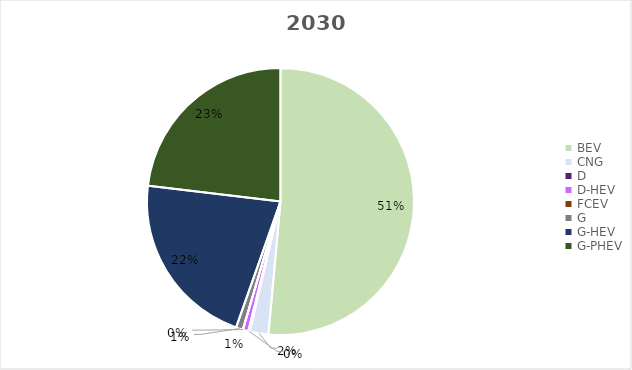
| Category | 2030 |
|---|---|
| BEV | 7480282.218 |
| CNG | 328924.876 |
| D | 24436.972 |
| D-HEV | 97448.298 |
| FCEV | 0 |
| G | 123605.033 |
| G-HEV | 3126183.291 |
| G-PHEV | 3360239.313 |